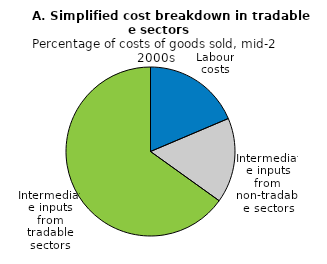
| Category | Series 0 |
|---|---|
| Labour costs | 0.187 |
| Intermediate inputs from non-tradable sectors | 0.164 |
| Intermediate inputs from tradable sectors | 0.654 |